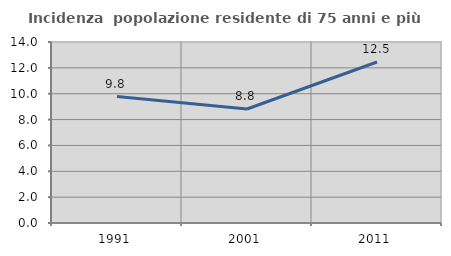
| Category | Incidenza  popolazione residente di 75 anni e più |
|---|---|
| 1991.0 | 9.778 |
| 2001.0 | 8.819 |
| 2011.0 | 12.456 |